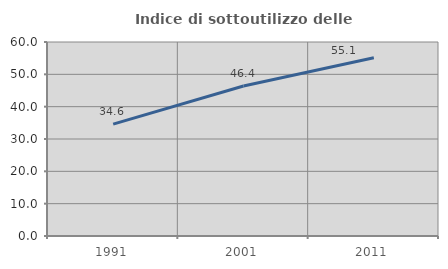
| Category | Indice di sottoutilizzo delle abitazioni  |
|---|---|
| 1991.0 | 34.615 |
| 2001.0 | 46.4 |
| 2011.0 | 55.118 |